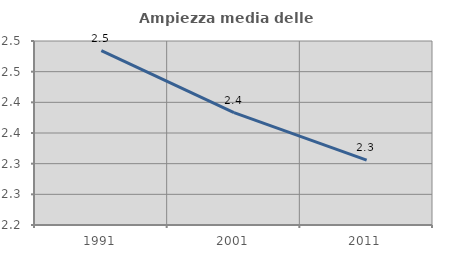
| Category | Ampiezza media delle famiglie |
|---|---|
| 1991.0 | 2.484 |
| 2001.0 | 2.383 |
| 2011.0 | 2.306 |